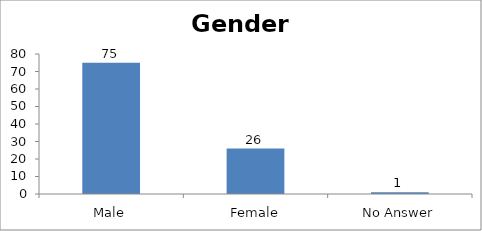
| Category | Gender |
|---|---|
| Male | 75 |
| Female | 26 |
| No Answer | 1 |